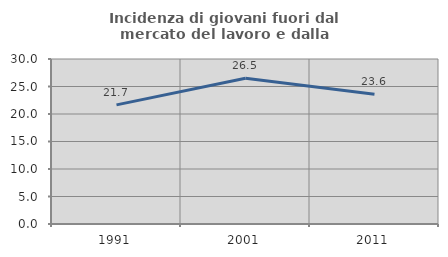
| Category | Incidenza di giovani fuori dal mercato del lavoro e dalla formazione  |
|---|---|
| 1991.0 | 21.661 |
| 2001.0 | 26.489 |
| 2011.0 | 23.609 |